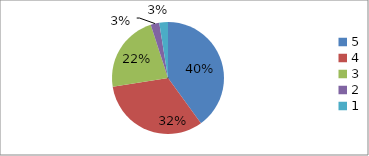
| Category | Series 0 | Series 1 |
|---|---|---|
| 5.0 | 40 | 40 |
| 4.0 | 32.5 | 32.5 |
| 3.0 | 22.5 | 22.5 |
| 2.0 | 2.5 | 2.5 |
| 1.0 | 2.5 | 2.5 |